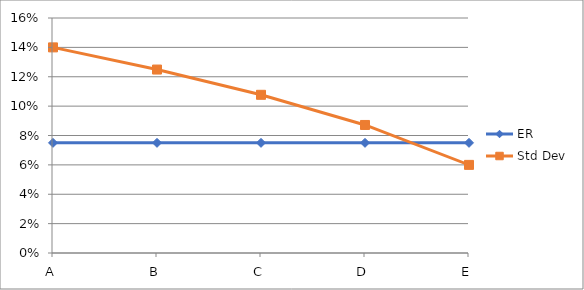
| Category | ER | Std Dev |
|---|---|---|
| A | 0.075 | 0.14 |
| B | 0.075 | 0.125 |
| C | 0.075 | 0.108 |
| D | 0.075 | 0.087 |
| E | 0.075 | 0.06 |